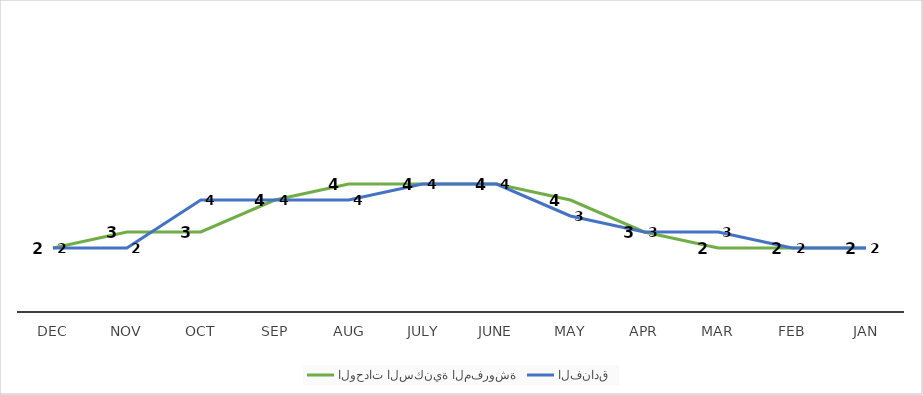
| Category | الوحدات السكنية المفروشة | الفنادق |
|---|---|---|
| Jan | 2 | 2 |
| Feb | 2 | 2 |
| Mar | 2 | 2.5 |
| Apr | 2.5 | 2.5 |
| May | 3.5 | 3 |
| June | 4 | 4 |
| July | 4 | 4 |
| Aug | 4 | 3.5 |
| Sep | 3.5 | 3.5 |
| Oct | 2.5 | 3.5 |
| Nov | 2.5 | 2 |
| Dec | 2 | 2 |